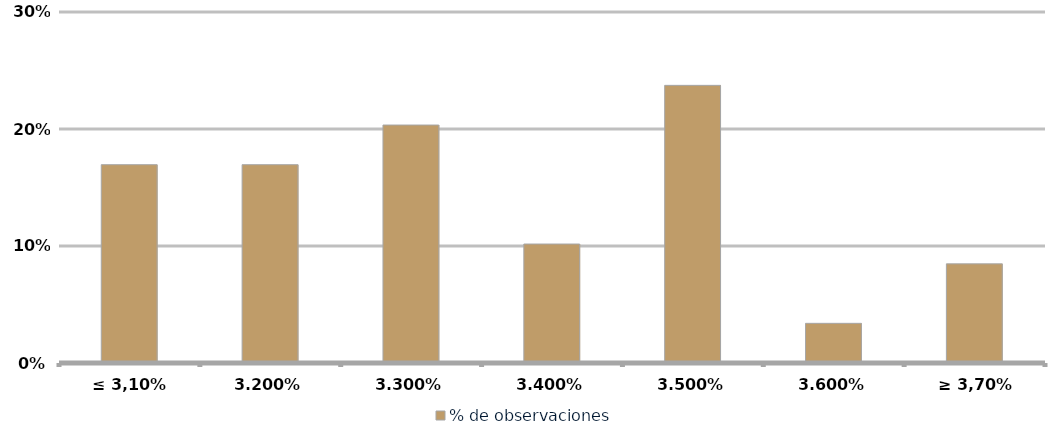
| Category | % de observaciones  |
|---|---|
| ≤ 3,10% | 0.169 |
| 3,20% | 0.169 |
| 3,30% | 0.203 |
| 3,40% | 0.102 |
| 3,50% | 0.237 |
| 3,60% | 0.034 |
| ≥ 3,70% | 0.085 |